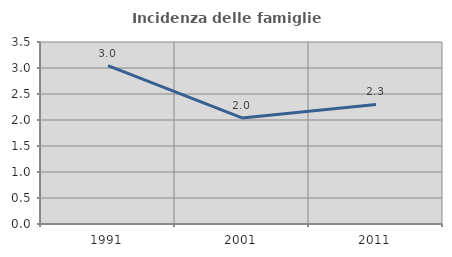
| Category | Incidenza delle famiglie numerose |
|---|---|
| 1991.0 | 3.045 |
| 2001.0 | 2.039 |
| 2011.0 | 2.3 |